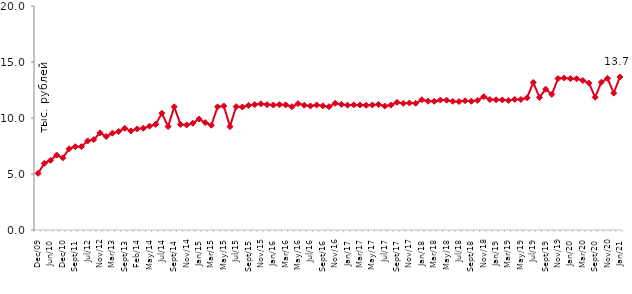
| Category | медианное значение среднедушевого располагаемого дохода, тыс. руб. |
|---|---|
| 2009-12-01 | 5.058 |
| 2010-04-01 | 5.949 |
| 2010-06-01 | 6.224 |
| 2010-09-01 | 6.686 |
| 2010-12-01 | 6.44 |
| 2011-07-01 | 7.25 |
| 2011-09-01 | 7.441 |
| 2011-12-01 | 7.446 |
| 2012-07-01 | 7.95 |
| 2012-09-01 | 8.071 |
| 2012-11-01 | 8.673 |
| 2012-12-01 | 8.345 |
| 2013-03-01 | 8.644 |
| 2013-06-01 | 8.789 |
| 2013-09-01 | 9.079 |
| 2013-12-01 | 8.849 |
| 2014-02-01 | 9.025 |
| 2014-04-01 | 9.087 |
| 2014-05-01 | 9.273 |
| 2014-06-01 | 9.432 |
| 2014-07-01 | 10.422 |
| 2014-08-01 | 9.241 |
| 2014-09-01 | 11 |
| 2014-10-01 | 9.426 |
| 2014-11-01 | 9.381 |
| 2014-12-01 | 9.532 |
| 2015-01-01 | 9.908 |
| 2015-02-01 | 9.585 |
| 2015-03-01 | 9.35 |
| 2015-04-01 | 10.991 |
| 2015-05-01 | 11.076 |
| 2015-06-01 | 9.237 |
| 2015-07-01 | 11.013 |
| 2015-08-01 | 10.981 |
| 2015-09-01 | 11.124 |
| 2015-10-01 | 11.195 |
| 2015-11-01 | 11.268 |
| 2015-12-01 | 11.194 |
| 2016-01-01 | 11.158 |
| 2016-02-01 | 11.188 |
| 2016-03-01 | 11.174 |
| 2016-04-01 | 11.01 |
| 2016-05-01 | 11.278 |
| 2016-06-01 | 11.142 |
| 2016-07-01 | 11.072 |
| 2016-08-01 | 11.165 |
| 2016-09-01 | 11.082 |
| 2016-10-01 | 11.008 |
| 2016-11-01 | 11.313 |
| 2016-12-01 | 11.216 |
| 2017-01-01 | 11.146 |
| 2017-02-01 | 11.17 |
| 2017-03-01 | 11.162 |
| 2017-04-01 | 11.133 |
| 2017-05-01 | 11.163 |
| 2017-06-01 | 11.207 |
| 2017-07-01 | 11.066 |
| 2017-08-01 | 11.153 |
| 2017-09-01 | 11.395 |
| 2017-10-01 | 11.301 |
| 2017-11-01 | 11.342 |
| 2017-12-01 | 11.31 |
| 2018-01-01 | 11.637 |
| 2018-02-01 | 11.497 |
| 2018-03-01 | 11.49 |
| 2018-04-01 | 11.601 |
| 2018-05-01 | 11.592 |
| 2018-06-01 | 11.491 |
| 2018-07-01 | 11.471 |
| 2018-08-01 | 11.541 |
| 2018-09-01 | 11.497 |
| 2018-10-01 | 11.578 |
| 2018-11-01 | 11.906 |
| 2018-12-01 | 11.648 |
| 2019-01-01 | 11.629 |
| 2019-02-01 | 11.617 |
| 2019-03-01 | 11.566 |
| 2019-04-01 | 11.659 |
| 2019-05-01 | 11.653 |
| 2019-06-01 | 11.805 |
| 2019-07-01 | 13.174 |
| 2019-08-01 | 11.844 |
| 2019-09-01 | 12.577 |
| 2019-10-01 | 12.107 |
| 2019-11-01 | 13.523 |
| 2019-12-01 | 13.573 |
| 2020-01-01 | 13.516 |
| 2020-02-01 | 13.502 |
| 2020-03-01 | 13.349 |
| 2020-08-01 | 13.113 |
| 2020-09-01 | 11.853 |
| 2020-10-01 | 13.196 |
| 2020-11-01 | 13.544 |
| 2020-12-01 | 12.222 |
| 2021-01-01 | 13.659 |